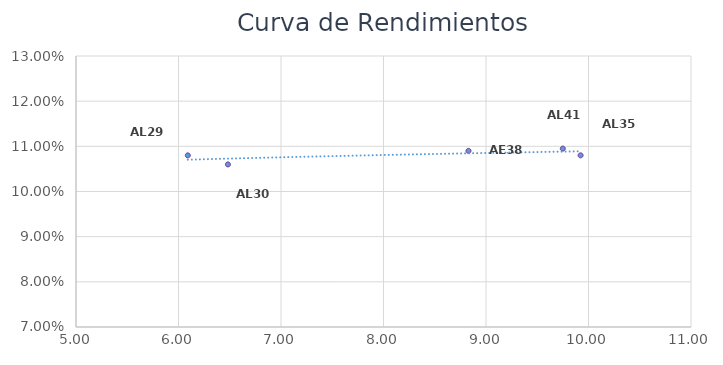
| Category | TIR N.A. |
|---|---|
| 6.090855850166048 | 0.108 |
| 6.482279356370346 | 0.106 |
| 9.922701903877735 | 0.108 |
| 8.829164297367358 | 0.109 |
| 9.74921068328489 | 0.11 |